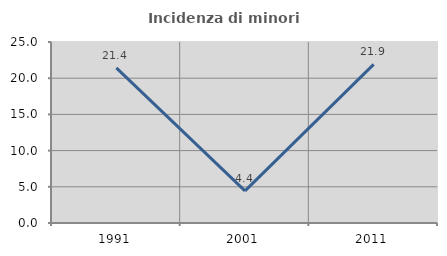
| Category | Incidenza di minori stranieri |
|---|---|
| 1991.0 | 21.429 |
| 2001.0 | 4.444 |
| 2011.0 | 21.905 |